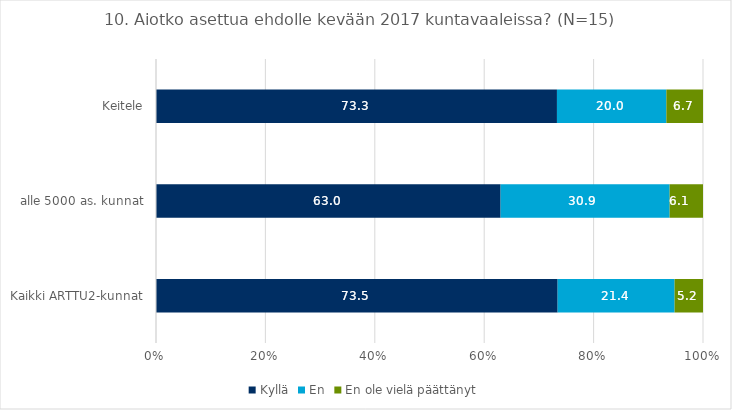
| Category | Kyllä | En | En ole vielä päättänyt |
|---|---|---|---|
| Kaikki ARTTU2-kunnat | 73.5 | 21.4 | 5.2 |
| alle 5000 as. kunnat | 63 | 30.9 | 6.1 |
| Keitele | 73.3 | 20 | 6.7 |